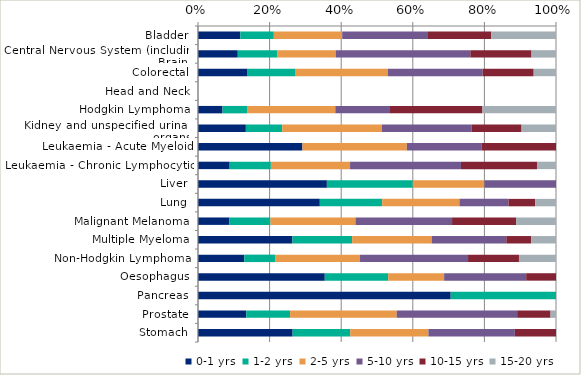
| Category | 0-1 yrs | 1-2 yrs | 2-5 yrs | 5-10 yrs | 10-15 yrs | 15-20 yrs |
|---|---|---|---|---|---|---|
| Bladder | 0.118 | 0.094 | 0.191 | 0.24 | 0.177 | 0.181 |
| Central Nervous System (including Brain) | 0.111 | 0.111 | 0.162 | 0.376 | 0.171 | 0.068 |
| Colorectal | 0.138 | 0.134 | 0.258 | 0.264 | 0.143 | 0.062 |
| Head and Neck | 0 | 0 | 0 | 0 | 0 | 0 |
| Hodgkin Lymphoma | 0.068 | 0.068 | 0.247 | 0.151 | 0.26 | 0.205 |
| Kidney and unspecified urinary organs | 0.134 | 0.102 | 0.278 | 0.251 | 0.139 | 0.096 |
| Leukaemia - Acute Myeloid | 0.292 | 0 | 0.292 | 0.208 | 0.208 | 0 |
| Leukaemia - Chronic Lymphocytic | 0.088 | 0.115 | 0.221 | 0.31 | 0.212 | 0.053 |
| Liver | 0.36 | 0.24 | 0.2 | 0.2 | 0 | 0 |
| Lung | 0.34 | 0.174 | 0.216 | 0.137 | 0.075 | 0.058 |
| Malignant Melanoma | 0.088 | 0.114 | 0.238 | 0.27 | 0.179 | 0.111 |
| Multiple Myeloma | 0.264 | 0.167 | 0.222 | 0.208 | 0.069 | 0.069 |
| Non-Hodgkin Lymphoma | 0.129 | 0.086 | 0.237 | 0.302 | 0.142 | 0.103 |
| Oesophagus | 0.354 | 0.177 | 0.156 | 0.229 | 0.083 | 0 |
| Pancreas | 0.706 | 0.294 | 0 | 0 | 0 | 0 |
| Prostate | 0.135 | 0.122 | 0.298 | 0.336 | 0.093 | 0.015 |
| Stomach | 0.264 | 0.161 | 0.218 | 0.241 | 0.115 | 0 |